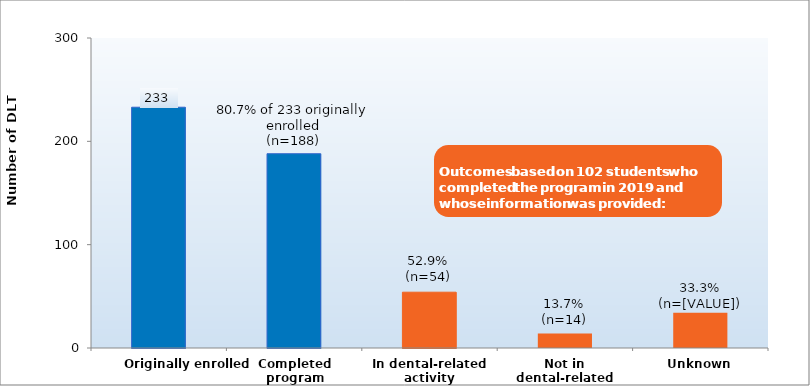
| Category | Series 0 |
|---|---|
| Originally enrolled | 233 |
| Completed program | 188 |
| In dental-related activity | 54 |
| Not in dental-related activity | 14 |
| Unknown | 34 |